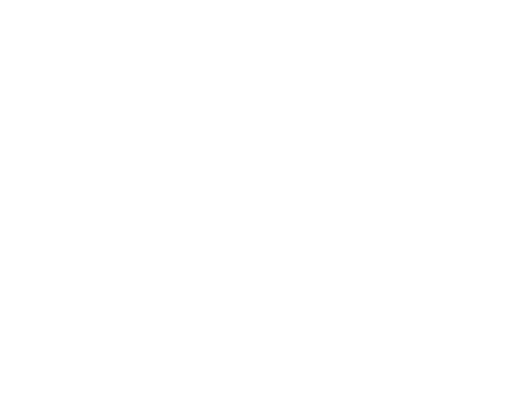
| Category | Series 0 | Series 1 | Series 2 |
|---|---|---|---|
| Impuestos | 2365766.27 | 0.068 |  |
| Cuotas y Aportaciones de Seguridad Social | 0 | 0 |  |
| Contribuciones de Mejoras | 0 | 0 |  |
| Derechos | 585020.39 | 0.017 |  |
| Productos | 77001.25 | 0.002 |  |
| Aprovechamientos | 62100 | 0.002 |  |
| Ingresos por Ventas de Bienes y Servicios | 0 | 0 |  |
| Participaciones y Aportaciones | 31654620.57 | 0.911 |  |
| Transferencias, Asignaciones, Subsidios y Otras Ayudas | 0 | 0 |  |
| Ingresos Derivados de Financiamientos | 0 | 0 |  |